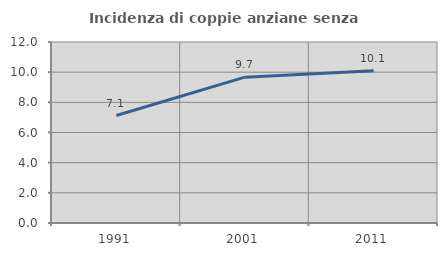
| Category | Incidenza di coppie anziane senza figli  |
|---|---|
| 1991.0 | 7.126 |
| 2001.0 | 9.668 |
| 2011.0 | 10.099 |